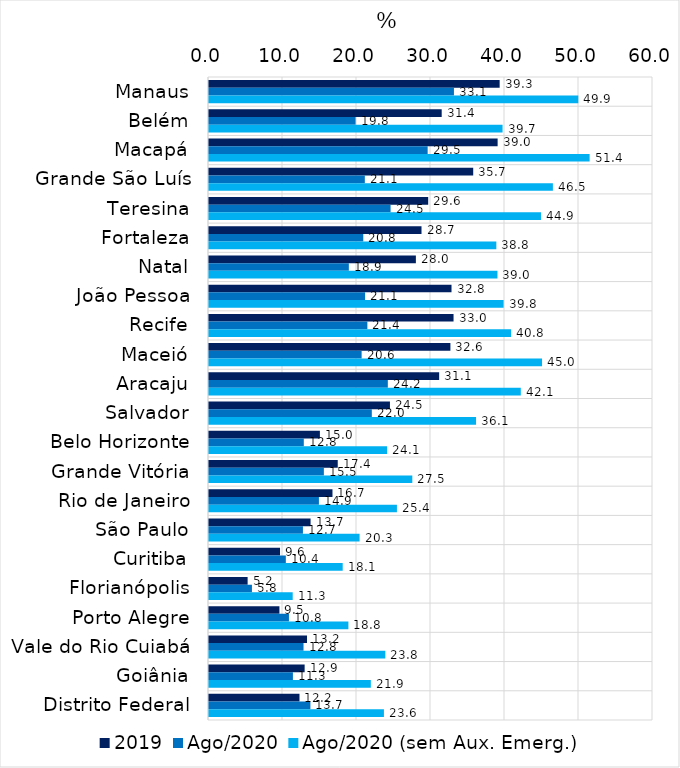
| Category | 2019 | Ago/2020 | Ago/2020 (sem Aux. Emerg.) |
|---|---|---|---|
| Manaus | 39.277 | 33.1 | 49.908 |
| Belém | 31.445 | 19.81 | 39.67 |
| Macapá | 39.004 | 29.548 | 51.436 |
| Grande São Luís | 35.705 | 21.059 | 46.472 |
| Teresina | 29.62 | 24.538 | 44.86 |
| Fortaleza | 28.718 | 20.848 | 38.83 |
| Natal | 27.956 | 18.898 | 38.981 |
| João Pessoa | 32.772 | 21.095 | 39.808 |
| Recife | 33.047 | 21.401 | 40.82 |
| Maceió | 32.623 | 20.625 | 45.006 |
| Aracaju | 31.103 | 24.166 | 42.135 |
| Salvador | 24.452 | 22.001 | 36.089 |
| Belo Horizonte | 14.985 | 12.811 | 24.066 |
| Grande Vitória | 17.397 | 15.522 | 27.474 |
| Rio de Janeiro | 16.686 | 14.853 | 25.395 |
| São Paulo | 13.727 | 12.694 | 20.348 |
| Curitiba | 9.599 | 10.381 | 18.069 |
| Florianópolis | 5.22 | 5.802 | 11.312 |
| Porto Alegre | 9.516 | 10.802 | 18.837 |
| Vale do Rio Cuiabá | 13.244 | 12.774 | 23.828 |
| Goiânia | 12.924 | 11.34 | 21.868 |
| Distrito Federal | 12.228 | 13.703 | 23.639 |